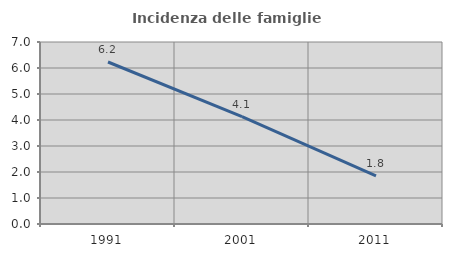
| Category | Incidenza delle famiglie numerose |
|---|---|
| 1991.0 | 6.23 |
| 2001.0 | 4.13 |
| 2011.0 | 1.849 |